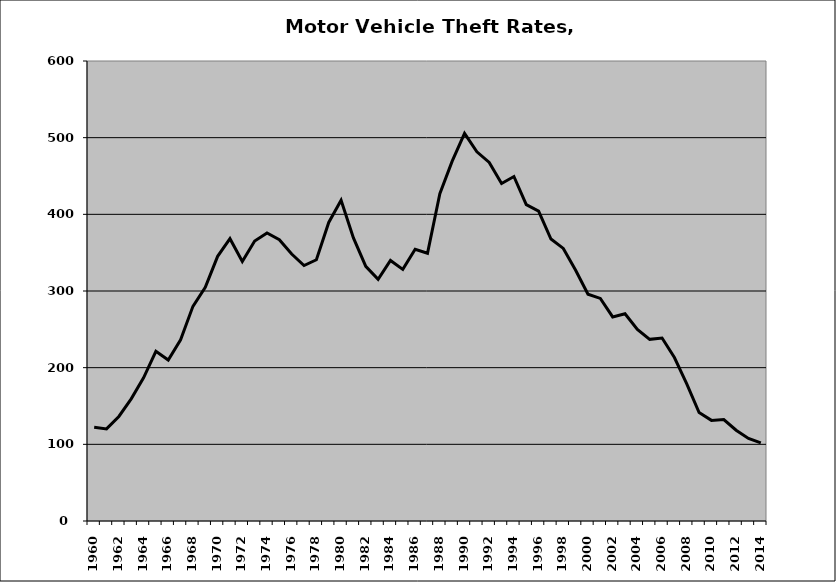
| Category | Motor Vehicle |
|---|---|
| 1960.0 | 122.392 |
| 1961.0 | 120.117 |
| 1962.0 | 136.34 |
| 1963.0 | 159.357 |
| 1964.0 | 186.735 |
| 1965.0 | 221.389 |
| 1966.0 | 209.877 |
| 1967.0 | 236.349 |
| 1968.0 | 280.02 |
| 1969.0 | 304.795 |
| 1970.0 | 345.221 |
| 1971.0 | 368.204 |
| 1972.0 | 338.521 |
| 1973.0 | 365.258 |
| 1974.0 | 375.665 |
| 1975.0 | 366.965 |
| 1976.0 | 348.196 |
| 1977.0 | 333.169 |
| 1978.0 | 340.723 |
| 1979.0 | 389.387 |
| 1980.0 | 418.336 |
| 1981.0 | 369.176 |
| 1982.0 | 332.179 |
| 1983.0 | 315.158 |
| 1984.0 | 339.837 |
| 1985.0 | 328.221 |
| 1986.0 | 354.361 |
| 1987.0 | 349.196 |
| 1988.0 | 426.815 |
| 1989.0 | 469.41 |
| 1990.0 | 505.502 |
| 1991.0 | 481.548 |
| 1992.0 | 467.741 |
| 1993.0 | 440.181 |
| 1994.0 | 449.328 |
| 1995.0 | 412.666 |
| 1996.0 | 404.247 |
| 1997.0 | 367.829 |
| 1998.0 | 355.537 |
| 1999.0 | 327.113 |
| 2000.0 | 295.781 |
| 2001.0 | 290.276 |
| 2002.0 | 266.181 |
| 2003.0 | 270.331 |
| 2004.0 | 249.861 |
| 2005.0 | 236.946 |
| 2006.0 | 238.638 |
| 2007.0 | 213.259 |
| 2008.0 | 178.962 |
| 2009.0 | 141.391 |
| 2010.0 | 131.227 |
| 2011.0 | 132.392 |
| 2012.0 | 118.399 |
| 2013.0 | 107.704 |
| 2014.0 | 101.977 |